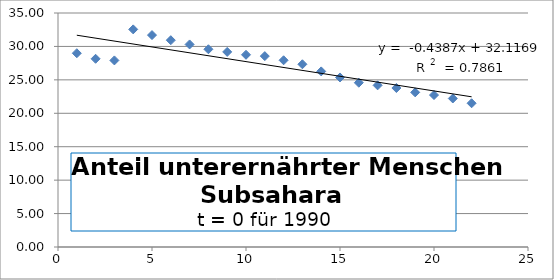
| Category | Series 0 |
|---|---|
| 1.0 | 28.982 |
| 2.0 | 28.152 |
| 3.0 | 27.909 |
| 4.0 | 32.55 |
| 5.0 | 31.697 |
| 6.0 | 30.933 |
| 7.0 | 30.297 |
| 8.0 | 29.577 |
| 9.0 | 29.179 |
| 10.0 | 28.752 |
| 11.0 | 28.552 |
| 12.0 | 27.928 |
| 13.0 | 27.331 |
| 14.0 | 26.266 |
| 15.0 | 25.359 |
| 16.0 | 24.573 |
| 17.0 | 24.179 |
| 18.0 | 23.78 |
| 19.0 | 23.13 |
| 20.0 | 22.728 |
| 21.0 | 22.215 |
| 22.0 | 21.501 |